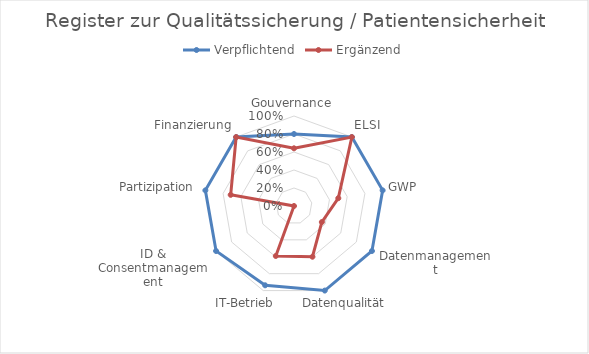
| Category | Verpflichtend | Ergänzend |
|---|---|---|
| Gouvernance | 0.8 | 0.641 |
| ELSI | 1 | 1 |
| GWP | 1 | 0.5 |
| Datenmanagement | 1 | 0.357 |
| Datenqualität | 1 | 0.6 |
| IT-Betrieb | 0.938 | 0.591 |
| ID & Consentmanagement | 1 | 0 |
| Partizipation | 1 | 0.714 |
| Finanzierung | 1 | 1 |